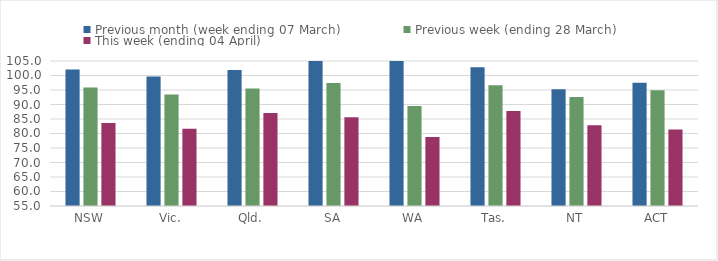
| Category | Previous month (week ending 07 March) | Previous week (ending 28 March) | This week (ending 04 April) |
|---|---|---|---|
| NSW | 102.057 | 95.825 | 83.627 |
| Vic. | 99.687 | 93.414 | 81.667 |
| Qld. | 101.939 | 95.54 | 87.084 |
| SA | 105.514 | 97.405 | 85.565 |
| WA | 113.131 | 89.461 | 78.803 |
| Tas. | 102.843 | 96.602 | 87.795 |
| NT | 95.25 | 92.621 | 82.867 |
| ACT | 97.493 | 94.912 | 81.342 |